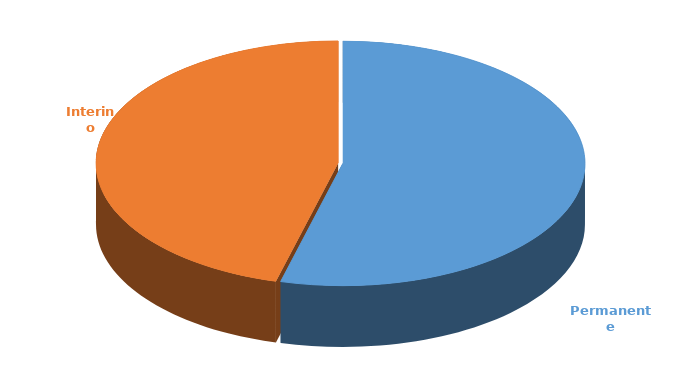
| Category | Cantidad |
|---|---|
| Permanente | 3137 |
| Interino | 2658 |